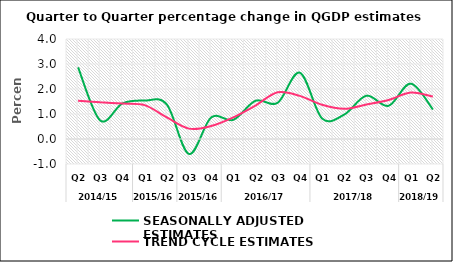
| Category | SEASONALLY ADJUSTED ESTIMATES | TREND CYCLE ESTIMATES |
|---|---|---|
| 0 | 2.865 | 1.534 |
| 1 | 0.739 | 1.47 |
| 2 | 1.423 | 1.416 |
| 3 | 1.536 | 1.353 |
| 4 | 1.383 | 0.865 |
| 5 | -0.598 | 0.415 |
| 6 | 0.86 | 0.522 |
| 7 | 0.767 | 0.866 |
| 8 | 1.529 | 1.339 |
| 9 | 1.449 | 1.869 |
| 10 | 2.651 | 1.726 |
| 11 | 0.823 | 1.368 |
| 12 | 0.976 | 1.209 |
| 13 | 1.731 | 1.379 |
| 14 | 1.327 | 1.561 |
| 15 | 2.214 | 1.86 |
| 16 | 1.182 | 1.7 |